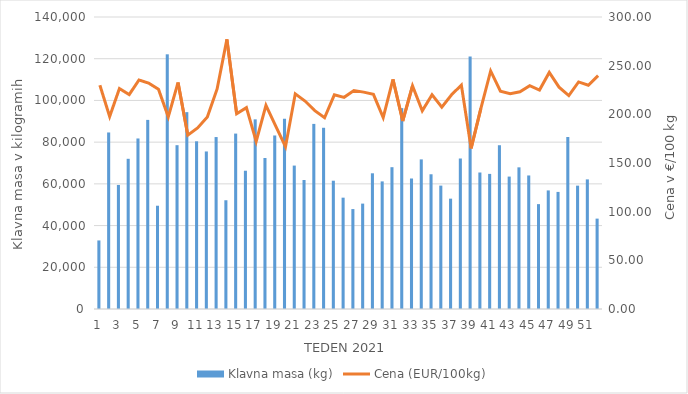
| Category | Klavna masa (kg) |
|---|---|
| 1.0 | 32871 |
| 2.0 | 84639 |
| 3.0 | 59476 |
| 4.0 | 72013 |
| 5.0 | 81759 |
| 6.0 | 90669 |
| 7.0 | 49517 |
| 8.0 | 122111 |
| 9.0 | 78545 |
| 10.0 | 94384 |
| 11.0 | 80405 |
| 12.0 | 75534 |
| 13.0 | 82440 |
| 14.0 | 52143 |
| 15.0 | 84105 |
| 16.0 | 66298 |
| 17.0 | 90925 |
| 18.0 | 72394 |
| 19.0 | 83193 |
| 20.0 | 91231 |
| 21.0 | 68763 |
| 22.0 | 61837 |
| 23.0 | 88747 |
| 24.0 | 86888 |
| 25.0 | 61507 |
| 26.0 | 53379 |
| 27.0 | 47910 |
| 28.0 | 50529 |
| 29.0 | 65062 |
| 30.0 | 61178 |
| 31.0 | 67992 |
| 32.0 | 96308 |
| 33.0 | 62558 |
| 34.0 | 71729 |
| 35.0 | 64596 |
| 36.0 | 59160 |
| 37.0 | 52905 |
| 38.0 | 72159 |
| 39.0 | 121060 |
| 40.0 | 65445 |
| 41.0 | 64780 |
| 42.0 | 78522 |
| 43.0 | 63486 |
| 44.0 | 67920 |
| 45.0 | 64023 |
| 46.0 | 50280 |
| 47.0 | 56852 |
| 48.0 | 56136 |
| 49.0 | 82462 |
| 50.0 | 59140 |
| 51.0 | 62144 |
| 52.0 | 43332 |